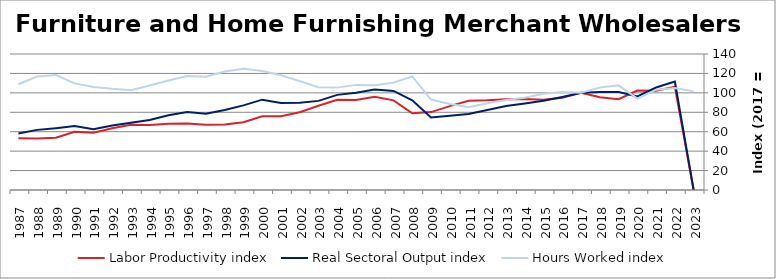
| Category | Labor Productivity index | Real Sectoral Output index | Hours Worked index |
|---|---|---|---|
| 2023.0 | 0 | 0 | 101.521 |
| 2022.0 | 106.264 | 111.537 | 104.962 |
| 2021.0 | 102.151 | 105.473 | 103.252 |
| 2020.0 | 102.419 | 96.298 | 94.023 |
| 2019.0 | 93.551 | 100.78 | 107.728 |
| 2018.0 | 95.487 | 100.819 | 105.584 |
| 2017.0 | 100 | 100 | 100 |
| 2016.0 | 95.032 | 95.757 | 100.763 |
| 2015.0 | 92.894 | 91.94 | 98.973 |
| 2014.0 | 93.712 | 89.036 | 95.01 |
| 2013.0 | 93.359 | 86.427 | 92.574 |
| 2012.0 | 92.37 | 82.424 | 89.232 |
| 2011.0 | 91.825 | 78.255 | 85.222 |
| 2010.0 | 86.343 | 76.45 | 88.542 |
| 2009.0 | 80.208 | 74.646 | 93.065 |
| 2008.0 | 78.959 | 92.262 | 116.848 |
| 2007.0 | 92.249 | 101.975 | 110.542 |
| 2006.0 | 95.98 | 103.517 | 107.853 |
| 2005.0 | 92.599 | 100.206 | 108.214 |
| 2004.0 | 92.909 | 97.921 | 105.395 |
| 2003.0 | 86.769 | 91.745 | 105.734 |
| 2002.0 | 80 | 89.701 | 112.127 |
| 2001.0 | 75.819 | 89.587 | 118.158 |
| 2000.0 | 75.928 | 92.997 | 122.481 |
| 1999.0 | 69.796 | 87.084 | 124.769 |
| 1998.0 | 67.508 | 82.323 | 121.945 |
| 1997.0 | 67.219 | 78.39 | 116.619 |
| 1996.0 | 68.431 | 80.276 | 117.31 |
| 1995.0 | 68.274 | 76.992 | 112.77 |
| 1994.0 | 67.039 | 72.126 | 107.588 |
| 1993.0 | 67.249 | 69.135 | 102.804 |
| 1992.0 | 63.66 | 66.322 | 104.182 |
| 1991.0 | 58.968 | 62.584 | 106.131 |
| 1990.0 | 60.021 | 65.876 | 109.755 |
| 1989.0 | 53.789 | 63.672 | 118.374 |
| 1988.0 | 52.982 | 61.899 | 116.831 |
| 1987.0 | 53.327 | 58.057 | 108.869 |